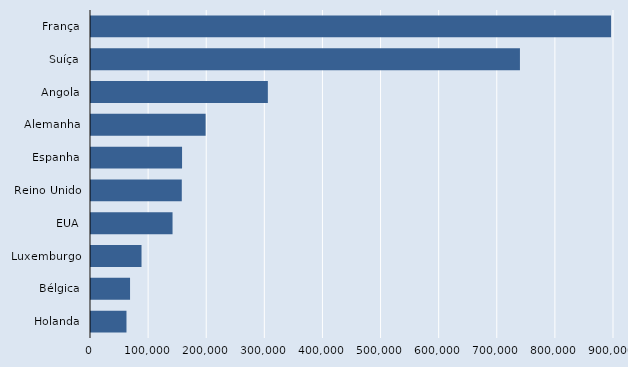
| Category | Series 2 |
|---|---|
| França | 894932 |
| Suíça | 738128 |
| Angola | 304328 |
| Alemanha | 197247 |
| Espanha | 156697 |
| Reino Unido | 156227 |
| EUA | 140320 |
| Luxemburgo | 86937 |
| Bélgica | 67205 |
| Holanda | 61053 |